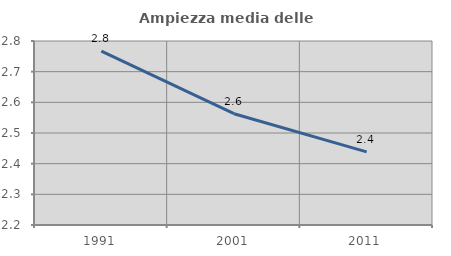
| Category | Ampiezza media delle famiglie |
|---|---|
| 1991.0 | 2.767 |
| 2001.0 | 2.563 |
| 2011.0 | 2.438 |